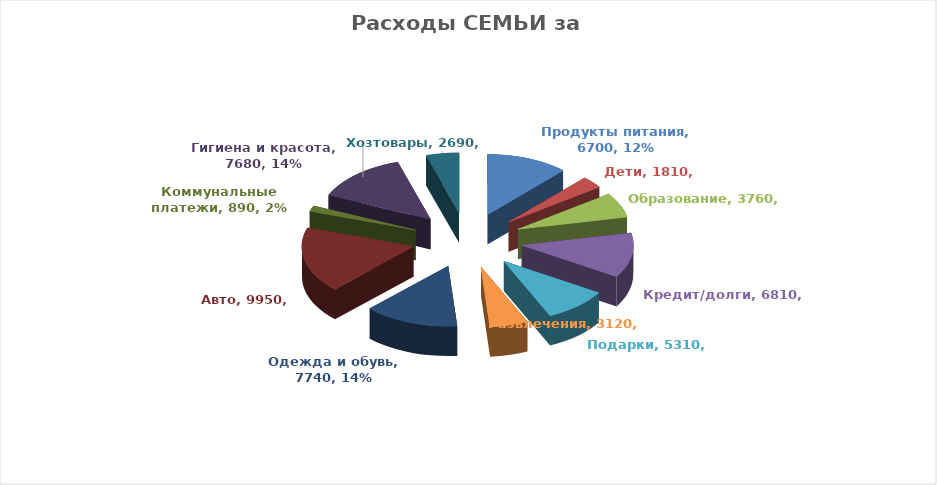
| Category | Series 3 | Series 0 | Series 1 | Series 2 |
|---|---|---|---|---|
| Продукты питания | 6700 |  |  | 6700 |
| Дети | 1810 |  |  | 1810 |
| Образование | 3760 |  |  | 3760 |
| Кредит/долги | 6810 |  |  | 6810 |
| Подарки | 5310 |  |  | 5310 |
| Развлечения | 3120 |  |  | 3120 |
| Одежда и обувь | 7740 |  |  | 7740 |
| Авто | 9950 |  |  | 9950 |
| Коммунальные платежи | 890 |  |  | 890 |
| Гигиена и красота | 7680 |  |  | 7680 |
| Хозтовары | 2690 |  |  | 2690 |